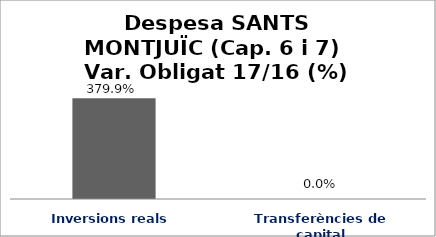
| Category | Series 0 |
|---|---|
| Inversions reals | 3.799 |
| Transferències de capital | 0 |